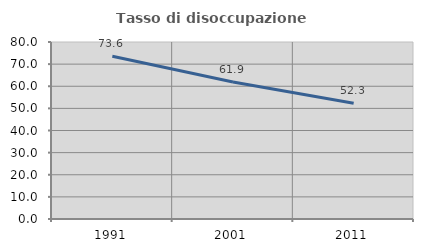
| Category | Tasso di disoccupazione giovanile  |
|---|---|
| 1991.0 | 73.563 |
| 2001.0 | 61.905 |
| 2011.0 | 52.308 |